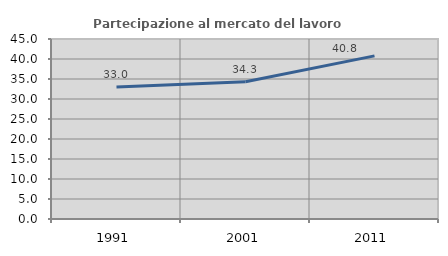
| Category | Partecipazione al mercato del lavoro  femminile |
|---|---|
| 1991.0 | 32.994 |
| 2001.0 | 34.306 |
| 2011.0 | 40.787 |